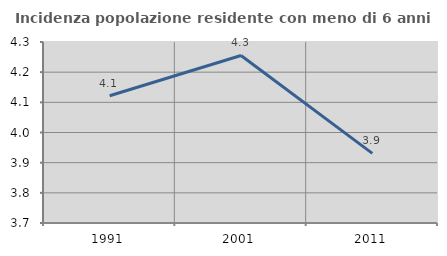
| Category | Incidenza popolazione residente con meno di 6 anni |
|---|---|
| 1991.0 | 4.122 |
| 2001.0 | 4.255 |
| 2011.0 | 3.931 |